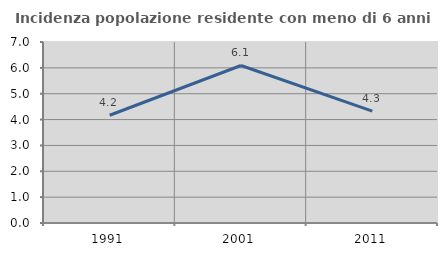
| Category | Incidenza popolazione residente con meno di 6 anni |
|---|---|
| 1991.0 | 4.167 |
| 2001.0 | 6.091 |
| 2011.0 | 4.324 |